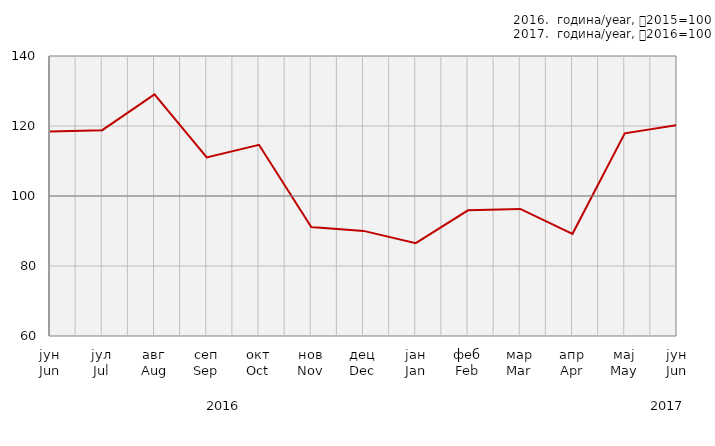
| Category | Индекси ноћења туриста
Tourist night indices |
|---|---|
| јун
Jun | 118.44 |
| јул
Jul | 118.819 |
| авг
Aug | 129.021 |
| сеп
Sep | 111.019 |
| окт
Oct | 114.634 |
| нов
Nov | 91.14 |
| дец
Dec | 90.034 |
| јан
Jan | 86.514 |
| феб
Feb | 95.907 |
| мар
Mar | 96.311 |
| апр
Apr | 89.193 |
| мај
May | 117.906 |
| јун
Jun | 120.259 |